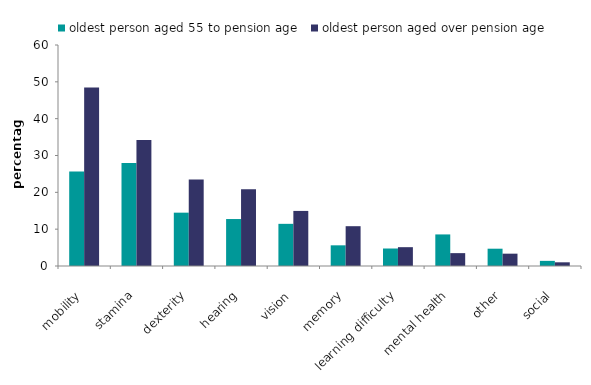
| Category | oldest person aged 55 to pension age | oldest person aged over pension age |
|---|---|---|
| mobility | 25.653 | 48.437 |
| stamina | 27.968 | 34.232 |
| dexterity | 14.481 | 23.476 |
| hearing | 12.75 | 20.844 |
| vision | 11.447 | 14.953 |
| memory | 5.615 | 10.807 |
| learning difficulty | 4.75 | 5.111 |
| mental health | 8.572 | 3.493 |
| other | 4.697 | 3.348 |
| social | 1.393 | 1.003 |